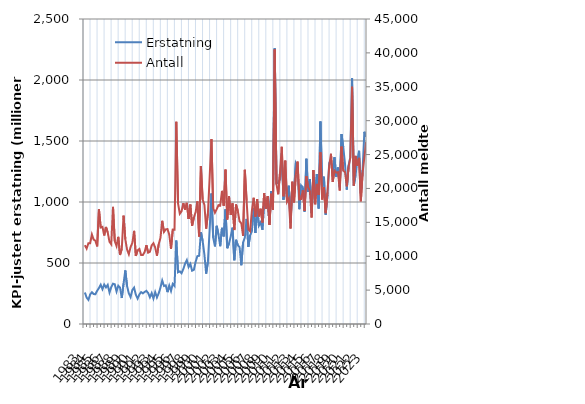
| Category | Erstatning |
|---|---|
| 1983.0 | 258.225 |
| nan | 216.303 |
| nan | 197.809 |
| nan | 242.308 |
| 1984.0 | 259.834 |
| nan | 245.784 |
| nan | 243.69 |
| nan | 272.569 |
| 1985.0 | 294.547 |
| nan | 321.948 |
| nan | 285.284 |
| nan | 323.55 |
| 1986.0 | 299.981 |
| nan | 320.992 |
| nan | 258.355 |
| nan | 302.335 |
| 1987.0 | 330.295 |
| nan | 325.94 |
| nan | 266.731 |
| nan | 313.817 |
| 1988.0 | 298.69 |
| nan | 212.92 |
| nan | 331.628 |
| nan | 439.315 |
| 1989.0 | 310.366 |
| nan | 250.85 |
| nan | 220.727 |
| nan | 278.472 |
| 1990.0 | 298.17 |
| nan | 239.878 |
| nan | 208.039 |
| nan | 242.149 |
| 1991.0 | 261.302 |
| nan | 251.241 |
| nan | 262.94 |
| nan | 271.847 |
| 1992.0 | 253.956 |
| nan | 218.822 |
| nan | 252.843 |
| nan | 208.646 |
| 1993.0 | 261.793 |
| nan | 217.87 |
| nan | 251.71 |
| nan | 297.781 |
| 1994.0 | 356.658 |
| nan | 311.8 |
| nan | 316.785 |
| nan | 261.11 |
| 1995.0 | 314.582 |
| nan | 270.634 |
| nan | 328.849 |
| nan | 312.226 |
| 1996.0 | 684.709 |
| nan | 423.984 |
| nan | 431.558 |
| nan | 416.204 |
| 1997.0 | 450.577 |
| nan | 494.432 |
| nan | 523.609 |
| nan | 467.18 |
| 1998.0 | 492.864 |
| nan | 436.631 |
| nan | 443.764 |
| nan | 510.057 |
| 1999.0 | 556.325 |
| nan | 559.028 |
| nan | 752.243 |
| nan | 681.255 |
| 2000.0 | 567.872 |
| nan | 412.399 |
| nan | 511.259 |
| nan | 779.512 |
| 2001.0 | 1069.791 |
| nan | 708.206 |
| nan | 636.063 |
| nan | 804.75 |
| 2002.0 | 732.931 |
| nan | 637.721 |
| nan | 788.114 |
| nan | 718.147 |
| 2003.0 | 939.238 |
| nan | 620.99 |
| nan | 660.655 |
| nan | 719.686 |
| 2004.0 | 789.535 |
| nan | 521.987 |
| nan | 690.088 |
| nan | 645.02 |
| 2005.0 | 631.317 |
| nan | 481.782 |
| nan | 668.844 |
| nan | 708.806 |
| 2006.0 | 861.566 |
| nan | 631.84 |
| nan | 727.01 |
| nan | 758.472 |
| 2007.0 | 949.379 |
| nan | 746.412 |
| nan | 953.667 |
| nan | 806.308 |
| 2008.0 | 833.827 |
| nan | 771.914 |
| nan | 1008.165 |
| nan | 968.238 |
| 2009.0 | 1016.058 |
| nan | 824.877 |
| nan | 1089.641 |
| nan | 1029.938 |
| 2010.0 | 2259.267 |
| nan | 1152.338 |
| nan | 1157.882 |
| nan | 1184.563 |
| 2011.0 | 1399.936 |
| nan | 1018.001 |
| nan | 1213.809 |
| nan | 1022.955 |
| 2012.0 | 1133.294 |
| nan | 828.542 |
| nan | 1142.327 |
| nan | 1075.609 |
| 2013.0 | 1320.961 |
| nan | 1293.47 |
| nan | 941.188 |
| nan | 1136.846 |
| 2014.0 | 1121.235 |
| nan | 920.756 |
| nan | 1354.48 |
| nan | 1082.988 |
| 2015.0 | 1188.179 |
| nan | 909.936 |
| nan | 1204.496 |
| nan | 1069.455 |
| 2016.0 | 1229.422 |
| nan | 946.332 |
| nan | 1659.698 |
| nan | 1126.106 |
| 2017.0 | 1207.17 |
| nan | 895.328 |
| nan | 1057.392 |
| nan | 1320.332 |
| 2018.0 | 1347.868 |
| nan | 1226.201 |
| nan | 1366.79 |
| nan | 1205.908 |
| 2019.0 | 1282.765 |
| nan | 1118.478 |
| nan | 1556.672 |
| nan | 1449.696 |
| 2020.0 | 1310.685 |
| nan | 1100.972 |
| nan | 1299.108 |
| nan | 1366.026 |
| 2021.0 | 2013.523 |
| nan | 1134.378 |
| nan | 1220.442 |
| nan | 1345.348 |
| 2022.0 | 1419.484 |
| nan | 1071.008 |
| nan | 1261.975 |
| nan | 1575.394 |
| 2023.0 | 1534.417 |